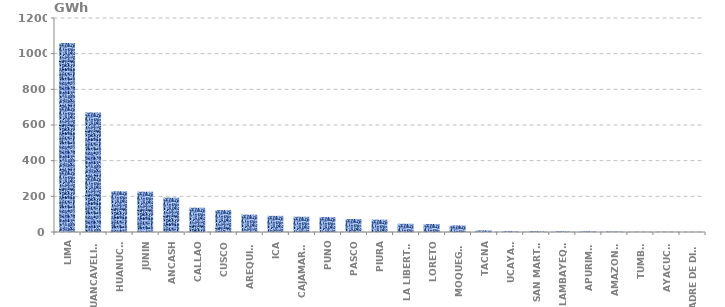
| Category | Series 0 |
|---|---|
| LIMA | 1059.689 |
| HUANCAVELICA | 669.865 |
| HUANUCO | 228.203 |
| JUNIN | 225.914 |
| ANCASH | 192.556 |
| CALLAO | 136.192 |
| CUSCO | 122.989 |
| AREQUIPA | 97.339 |
| ICA | 90.528 |
| CAJAMARCA | 85.606 |
| PUNO | 83.676 |
| PASCO | 72.793 |
| PIURA | 69.22 |
| LA LIBERTAD | 46.131 |
| LORETO | 45.058 |
| MOQUEGUA | 36.723 |
| TACNA | 9.085 |
| UCAYALI | 4.148 |
| SAN MARTÍN | 3.914 |
| LAMBAYEQUE | 3.832 |
| APURIMAC | 3.537 |
| AMAZONAS | 2.176 |
| TUMBES | 0.802 |
| AYACUCHO | 0.723 |
| MADRE DE DIOS | 0.208 |